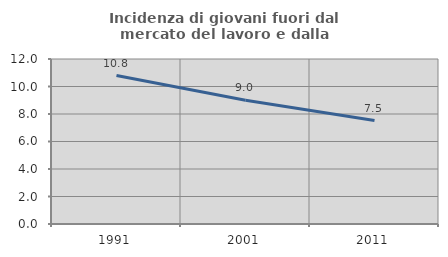
| Category | Incidenza di giovani fuori dal mercato del lavoro e dalla formazione  |
|---|---|
| 1991.0 | 10.8 |
| 2001.0 | 9.005 |
| 2011.0 | 7.527 |